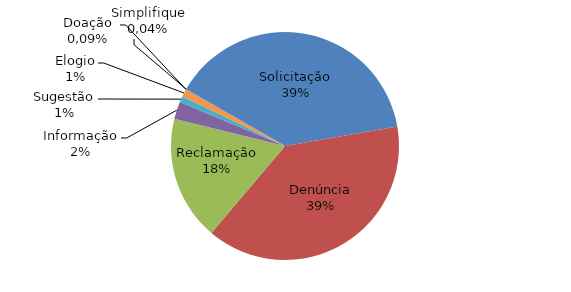
| Category | Series 0 |
|---|---|
| Solicitação | 16270 |
| Denúncia | 16270 |
| Reclamação | 7398 |
| Informação | 1025 |
| Sugestão | 361 |
| Elogio | 434 |
| Doação | 36 |
| Simplifique | 15 |